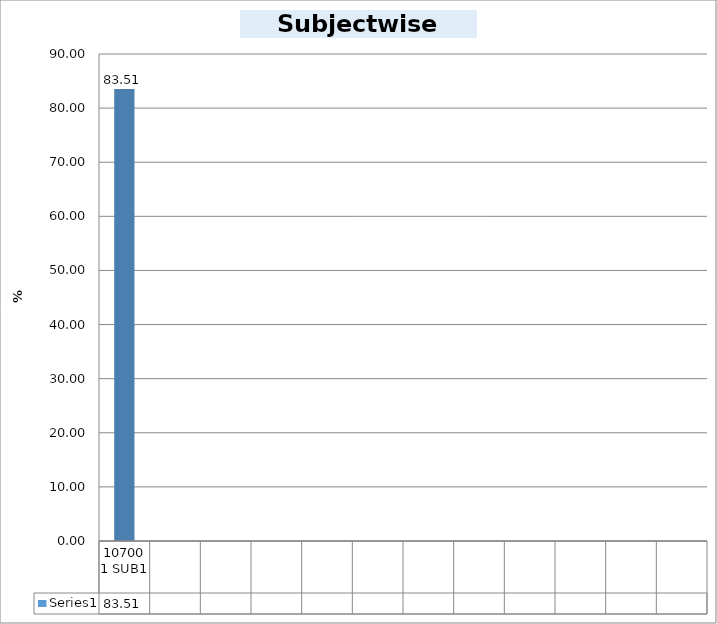
| Category | Series 0 |
|---|---|
| 107001 SUB1 | 83.515 |